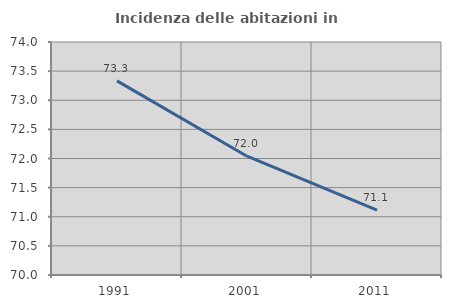
| Category | Incidenza delle abitazioni in proprietà  |
|---|---|
| 1991.0 | 73.333 |
| 2001.0 | 72.04 |
| 2011.0 | 71.113 |